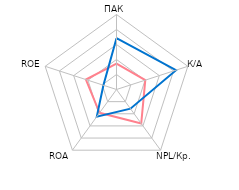
| Category | Србија | Регион |
|---|---|---|
| ПАК | 1.732 | 3.42 |
| К/А | 2.018 | 4.172 |
| NPL/Кр. | 2.804 | 1.582 |
| ROA | 1.92 | 2.235 |
| ROE | 2.146 | 0.918 |